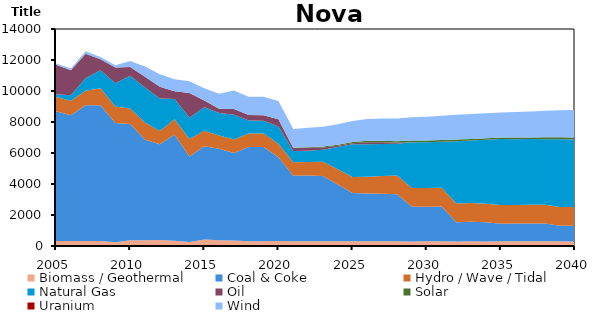
| Category | Biomass / Geothermal | Coal & Coke | Hydro / Wave / Tidal | Natural Gas | Oil | Solar | Uranium | Wind |
|---|---|---|---|---|---|---|---|---|
| 2005.0 | 318 | 8374.984 | 926.065 | 165.12 | 1911.496 | 0 | 0 | 85 |
| 2006.0 | 318 | 8119.944 | 926.065 | 354.872 | 1624.086 | 0 | 0 | 110 |
| 2007.0 | 318 | 8768.63 | 926.065 | 804.62 | 1586.952 | 0 | 0 | 157 |
| 2008.0 | 322 | 8765.973 | 1096.663 | 1158.914 | 708.159 | 0 | 0 | 149 |
| 2009.0 | 245 | 7688.15 | 1074.14 | 1489.508 | 1014.587 | 0 | 0 | 154 |
| 2010.0 | 378 | 7492.966 | 1007.811 | 2111.399 | 563.73 | 0 | 0 | 387 |
| 2011.0 | 363 | 6494.95 | 1112.474 | 2260.781 | 693.239 | 0 | 0 | 664.188 |
| 2012.0 | 387 | 6173.748 | 851.497 | 2103.871 | 762.457 | 0 | 0 | 800 |
| 2013.0 | 331 | 6848.48 | 1005.758 | 1291.846 | 512.589 | 0 | 0 | 765 |
| 2014.0 | 253.9 | 5521.816 | 1128.686 | 1363.723 | 1608.56 | 0 | 0 | 748.678 |
| 2015.0 | 413.5 | 6025.074 | 990.309 | 1526.144 | 425.383 | 0 | 0 | 800.794 |
| 2016.0 | 376.366 | 5896.869 | 852.816 | 1447.441 | 287.323 | 0 | 0 | 957.906 |
| 2017.0 | 357.468 | 5640.661 | 874.376 | 1589.127 | 382.544 | 0 | 0 | 1182.616 |
| 2018.0 | 306.321 | 6078.145 | 874.358 | 831.89 | 362.689 | 0 | 0 | 1182.604 |
| 2019.0 | 306.328 | 6078.119 | 874.382 | 820.37 | 361.581 | 0 | 0 | 1182.618 |
| 2020.0 | 324.306 | 5400.488 | 874.363 | 1109.197 | 467.982 | 0 | 0 | 1182.607 |
| 2021.0 | 306.329 | 4224.854 | 874.385 | 719.629 | 195.235 | 16.962 | 0 | 1217.662 |
| 2022.0 | 306.324 | 4241.399 | 874.368 | 719.629 | 197.894 | 33.517 | 0 | 1252.688 |
| 2023.0 | 308.944 | 4200.652 | 927.731 | 766.178 | 157.849 | 50.246 | 0 | 1287.74 |
| 2024.0 | 309.349 | 3662.341 | 981.33 | 1431.938 | 80.23 | 68.032 | 0 | 1322.768 |
| 2025.0 | 308.092 | 3110.015 | 1035.127 | 2117.469 | 53.882 | 85.978 | 0 | 1357.822 |
| 2026.0 | 310.752 | 3072.406 | 1092.227 | 2083.761 | 131.991 | 104.072 | 0 | 1392.845 |
| 2027.0 | 310.36 | 3063.702 | 1149.954 | 2061.236 | 103.65 | 104.071 | 0 | 1427.883 |
| 2028.0 | 309.866 | 3036.273 | 1208.138 | 2036.909 | 63.024 | 104.074 | 0 | 1462.942 |
| 2029.0 | 296.78 | 2230.964 | 1208.143 | 2957.071 | 8.574 | 104.075 | 0 | 1497.989 |
| 2030.0 | 308.198 | 2225.027 | 1208.129 | 2951.413 | 8.717 | 104.073 | 0 | 1533.011 |
| 2031.0 | 308.492 | 2242.023 | 1208.133 | 2960.781 | 9.368 | 104.074 | 0 | 1568.058 |
| 2032.0 | 295.828 | 1240.315 | 1208.141 | 4012.713 | 3.413 | 104.075 | 0 | 1603.108 |
| 2033.0 | 309.366 | 1260.856 | 1208.132 | 4024.262 | 3.487 | 104.073 | 0 | 1603.097 |
| 2034.0 | 297.05 | 1227.714 | 1208.138 | 4118.497 | 3.348 | 104.074 | 0 | 1603.105 |
| 2035.0 | 298.616 | 1141.852 | 1208.137 | 4248.903 | 3.157 | 104.074 | 0 | 1603.103 |
| 2036.0 | 298.713 | 1145.148 | 1208.134 | 4242.656 | 3.171 | 104.074 | 0 | 1638.137 |
| 2037.0 | 298.798 | 1148.911 | 1208.138 | 4241.693 | 3.184 | 104.075 | 0 | 1673.188 |
| 2038.0 | 298.935 | 1153.615 | 1208.125 | 4228.035 | 3.205 | 121.85 | 0 | 1708.201 |
| 2039.0 | 299.79 | 1003.344 | 1208.128 | 4372.95 | 2.663 | 121.851 | 0 | 1743.248 |
| 2040.0 | 289.508 | 1015.218 | 1208.137 | 4365.298 | 2.709 | 121.853 | 0 | 1778.304 |